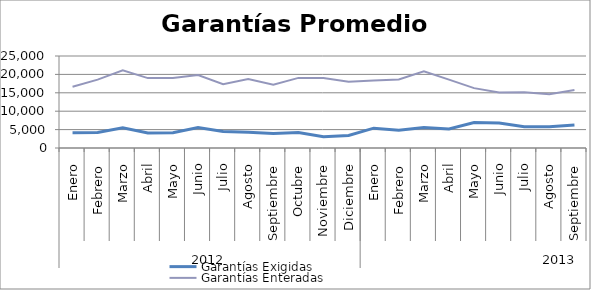
| Category | Garantías Exigidas | Garantías Enteradas |
|---|---|---|
| 0 | 4146.8 | 16662.483 |
| 1 | 4190.531 | 18572.749 |
| 2 | 5482.211 | 21128.648 |
| 3 | 4079.038 | 18997.51 |
| 4 | 4141.554 | 19005.364 |
| 5 | 5549.139 | 19818.91 |
| 6 | 4487.023 | 17351.39 |
| 7 | 4277.924 | 18719.955 |
| 8 | 3940.893 | 17217.403 |
| 9 | 4180.69 | 19046.939 |
| 10 | 3056.997 | 19028.425 |
| 11 | 3426.799 | 17994.819 |
| 12 | 5390.461 | 18317.043 |
| 13 | 4807.91 | 18608.477 |
| 14 | 5582.739 | 20850.446 |
| 15 | 5196.755 | 18583.166 |
| 16 | 6912.615 | 16266.455 |
| 17 | 6790.981 | 15108.06 |
| 18 | 5787.122 | 15161.964 |
| 19 | 5780.082 | 14588.597 |
| 20 | 6263.345 | 15743.621 |